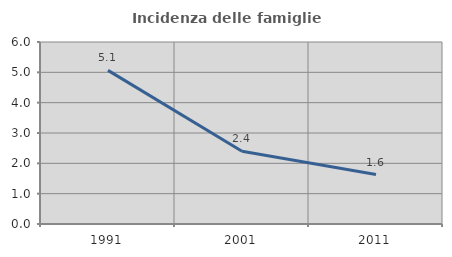
| Category | Incidenza delle famiglie numerose |
|---|---|
| 1991.0 | 5.065 |
| 2001.0 | 2.401 |
| 2011.0 | 1.63 |